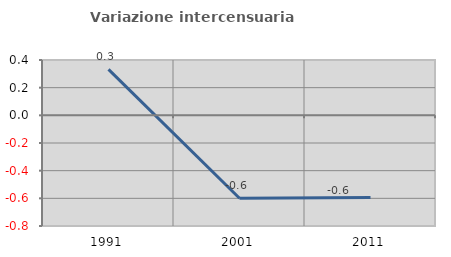
| Category | Variazione intercensuaria annua |
|---|---|
| 1991.0 | 0.333 |
| 2001.0 | -0.599 |
| 2011.0 | -0.594 |